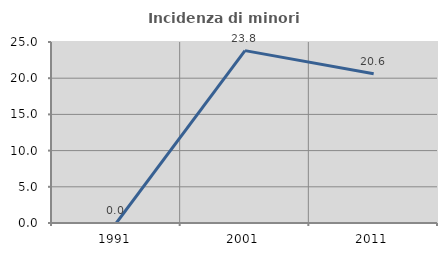
| Category | Incidenza di minori stranieri |
|---|---|
| 1991.0 | 0 |
| 2001.0 | 23.81 |
| 2011.0 | 20.611 |